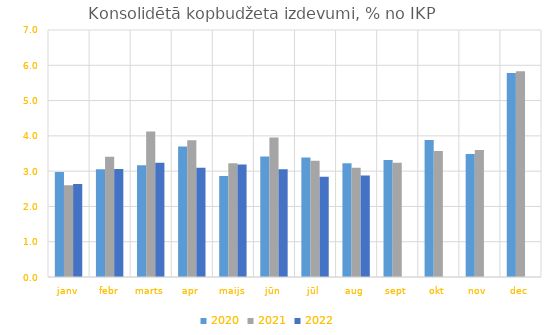
| Category | 2020 | 2021 | 2022 |
|---|---|---|---|
| janv | 2.976 | 2.603 | 2.637 |
| febr | 3.051 | 3.408 | 3.062 |
| marts | 3.169 | 4.125 | 3.238 |
| apr | 3.697 | 3.875 | 3.095 |
| maijs | 2.865 | 3.227 | 3.191 |
| jūn | 3.414 | 3.955 | 3.055 |
| jūl | 3.388 | 3.292 | 2.838 |
| aug | 3.226 | 3.096 | 2.88 |
| sept | 3.317 | 3.239 | 0 |
| okt | 3.883 | 3.572 | 0 |
| nov | 3.485 | 3.597 | 0 |
| dec | 5.782 | 5.828 | 0 |